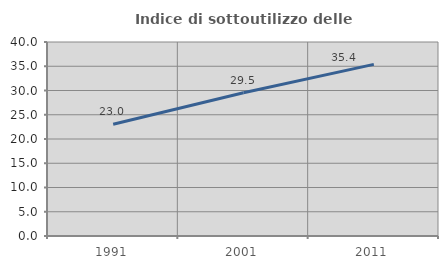
| Category | Indice di sottoutilizzo delle abitazioni  |
|---|---|
| 1991.0 | 23.032 |
| 2001.0 | 29.544 |
| 2011.0 | 35.388 |